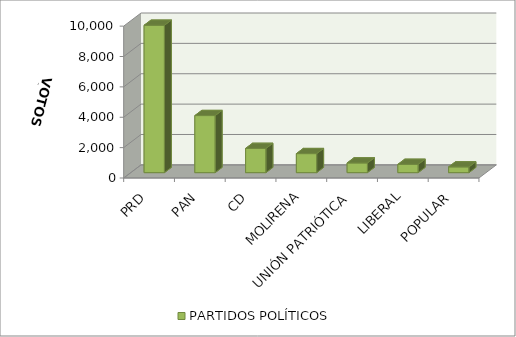
| Category | PARTIDOS POLÍTICOS |
|---|---|
| PRD | 9704 |
| PAN | 3757 |
| CD | 1594 |
| MOLIRENA | 1252 |
| UNIÓN PATRIÓTICA | 636 |
| LIBERAL | 545 |
| POPULAR | 377 |